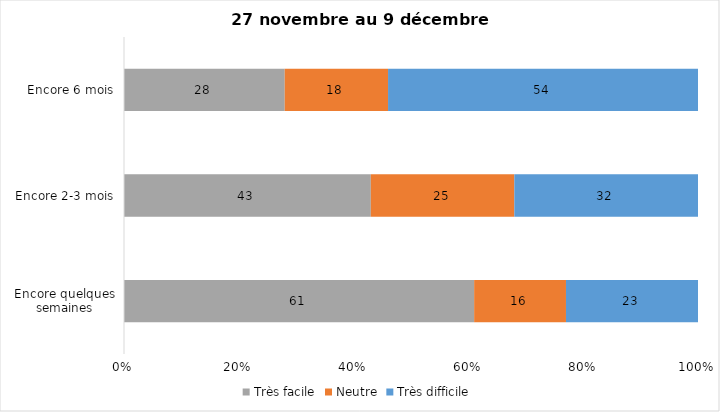
| Category | Très facile | Neutre | Très difficile |
|---|---|---|---|
| Encore quelques semaines | 61 | 16 | 23 |
| Encore 2-3 mois | 43 | 25 | 32 |
| Encore 6 mois | 28 | 18 | 54 |